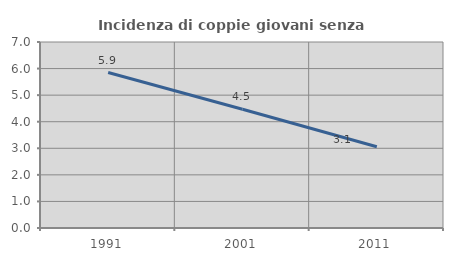
| Category | Incidenza di coppie giovani senza figli |
|---|---|
| 1991.0 | 5.852 |
| 2001.0 | 4.47 |
| 2011.0 | 3.06 |